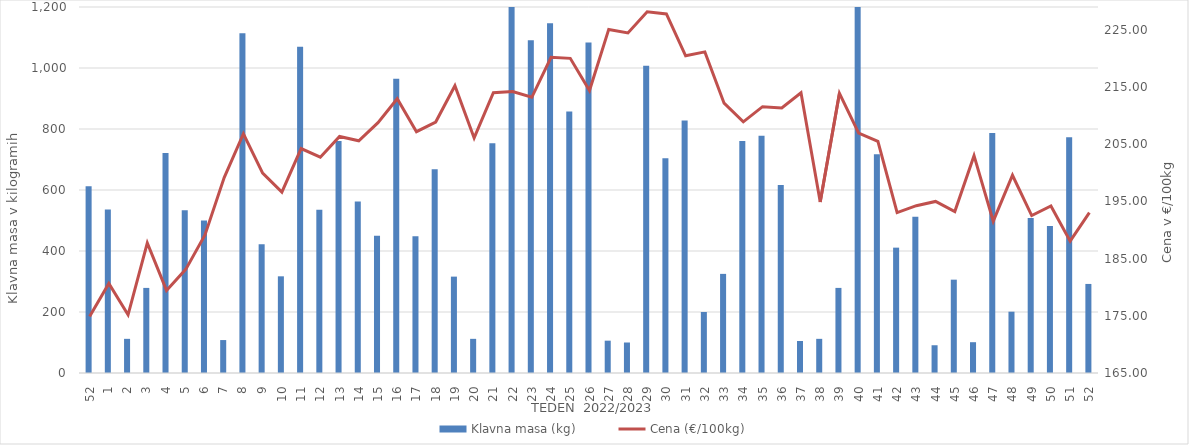
| Category | Klavna masa (kg) |
|---|---|
| 52.0 | 612 |
| 1.0 | 536 |
| 2.0 | 112 |
| 3.0 | 279 |
| 4.0 | 721 |
| 5.0 | 534 |
| 6.0 | 500 |
| 7.0 | 108 |
| 8.0 | 1114 |
| 9.0 | 422 |
| 10.0 | 317 |
| 11.0 | 1070 |
| 12.0 | 535 |
| 13.0 | 761 |
| 14.0 | 562 |
| 15.0 | 450 |
| 16.0 | 965 |
| 17.0 | 448 |
| 18.0 | 668 |
| 19.0 | 316 |
| 20.0 | 112 |
| 21.0 | 753 |
| 22.0 | 1423 |
| 23.0 | 1091 |
| 24.0 | 1147 |
| 25.0 | 857 |
| 26.0 | 1084 |
| 27.0 | 106 |
| 28.0 | 100 |
| 29.0 | 1007 |
| 30.0 | 704 |
| 31.0 | 828 |
| 32.0 | 200 |
| 33.0 | 325 |
| 34.0 | 761 |
| 35.0 | 778 |
| 36.0 | 616 |
| 37.0 | 105 |
| 38.0 | 112 |
| 39.0 | 279 |
| 40.0 | 1535 |
| 41.0 | 717 |
| 42.0 | 411 |
| 43.0 | 512 |
| 44.0 | 91 |
| 45.0 | 306 |
| 46.0 | 101 |
| 47.0 | 787 |
| 48.0 | 201 |
| 49.0 | 508 |
| 50.0 | 482 |
| 51.0 | 773 |
| 52.0 | 292 |